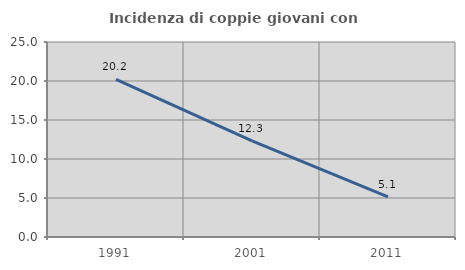
| Category | Incidenza di coppie giovani con figli |
|---|---|
| 1991.0 | 20.222 |
| 2001.0 | 12.312 |
| 2011.0 | 5.147 |